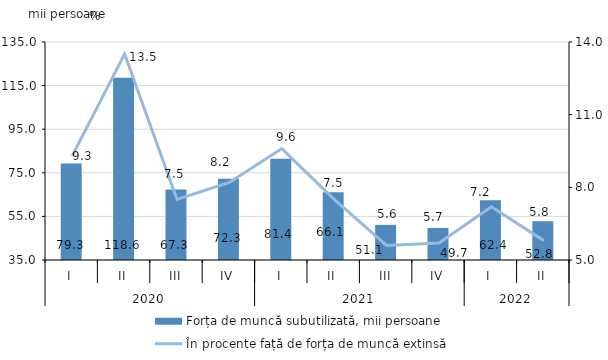
| Category | Forța de muncă subutilizată, mii persoane |
|---|---|
| 0 | 79.3 |
| 1 | 118.6 |
| 2 | 67.3 |
| 3 | 72.3 |
| 4 | 81.4 |
| 5 | 66.1 |
| 6 | 51.1 |
| 7 | 49.7 |
| 8 | 62.4 |
| 9 | 52.8 |